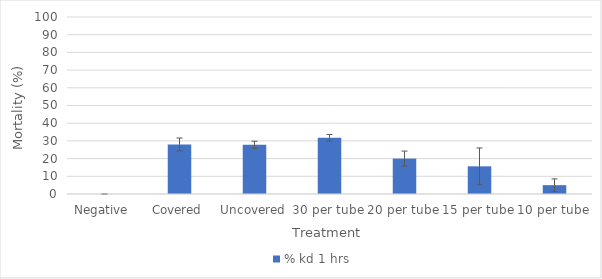
| Category | % kd 1 hrs |
|---|---|
| Negative  | 0 |
| Covered | 28 |
| Uncovered | 27.778 |
| 30 per tube | 31.746 |
| 20 per tube | 20 |
| 15 per tube | 15.625 |
| 10 per tube | 5 |